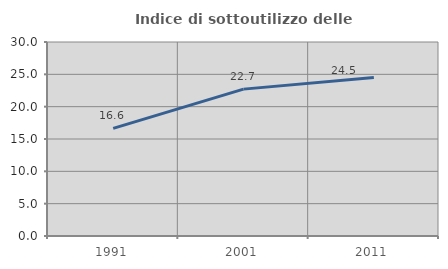
| Category | Indice di sottoutilizzo delle abitazioni  |
|---|---|
| 1991.0 | 16.644 |
| 2001.0 | 22.712 |
| 2011.0 | 24.512 |